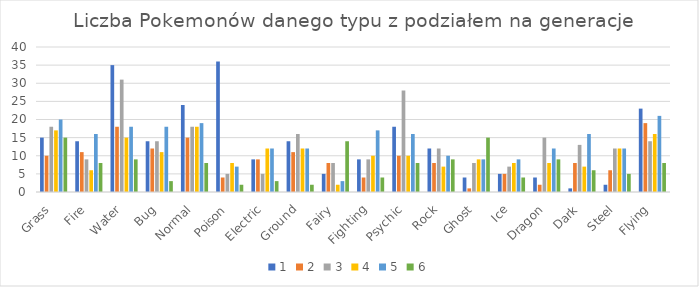
| Category | 1 | 2 | 3 | 4 | 5 | 6 |
|---|---|---|---|---|---|---|
| Grass | 15 | 10 | 18 | 17 | 20 | 15 |
| Fire | 14 | 11 | 9 | 6 | 16 | 8 |
| Water | 35 | 18 | 31 | 15 | 18 | 9 |
| Bug | 14 | 12 | 14 | 11 | 18 | 3 |
| Normal | 24 | 15 | 18 | 18 | 19 | 8 |
| Poison | 36 | 4 | 5 | 8 | 7 | 2 |
| Electric | 9 | 9 | 5 | 12 | 12 | 3 |
| Ground | 14 | 11 | 16 | 12 | 12 | 2 |
| Fairy | 5 | 8 | 8 | 2 | 3 | 14 |
| Fighting | 9 | 4 | 9 | 10 | 17 | 4 |
| Psychic | 18 | 10 | 28 | 10 | 16 | 8 |
| Rock | 12 | 8 | 12 | 7 | 10 | 9 |
| Ghost | 4 | 1 | 8 | 9 | 9 | 15 |
| Ice | 5 | 5 | 7 | 8 | 9 | 4 |
| Dragon | 4 | 2 | 15 | 8 | 12 | 9 |
| Dark | 1 | 8 | 13 | 7 | 16 | 6 |
| Steel | 2 | 6 | 12 | 12 | 12 | 5 |
| Flying | 23 | 19 | 14 | 16 | 21 | 8 |